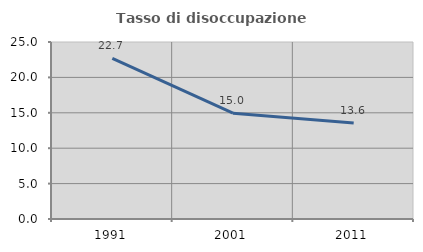
| Category | Tasso di disoccupazione giovanile  |
|---|---|
| 1991.0 | 22.695 |
| 2001.0 | 14.953 |
| 2011.0 | 13.559 |